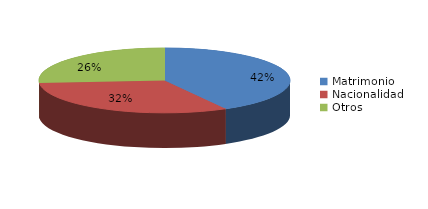
| Category | Series 0 |
|---|---|
| Matrimonio | 1996 |
| Nacionalidad | 1516 |
| Otros | 1250 |